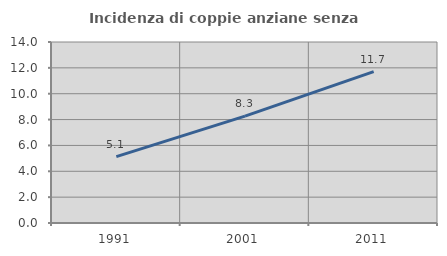
| Category | Incidenza di coppie anziane senza figli  |
|---|---|
| 1991.0 | 5.139 |
| 2001.0 | 8.266 |
| 2011.0 | 11.712 |